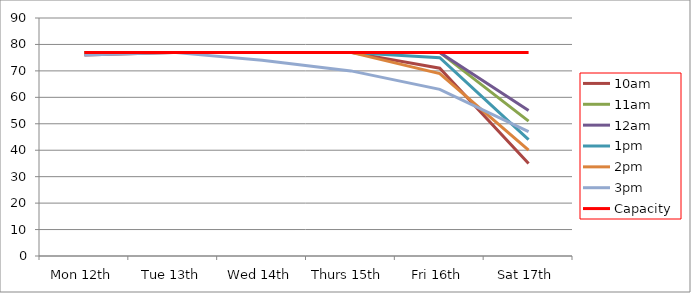
| Category | 9am | 10am | 11am | 12am | 1pm | 2pm | 3pm | 4pm | 5pm | Capacity |
|---|---|---|---|---|---|---|---|---|---|---|
| Mon 12th |  | 76 | 77 | 77 | 77 | 77 | 76 |  |  | 77 |
| Tue 13th |  | 77 | 77 | 77 | 77 | 77 | 77 |  |  | 77 |
| Wed 14th |  | 77 | 77 | 77 | 77 | 77 | 74 |  |  | 77 |
| Thurs 15th |  | 77 | 77 | 77 | 77 | 77 | 70 |  |  | 77 |
| Fri 16th |  | 71 | 77 | 77 | 75 | 69 | 63 |  |  | 77 |
| Sat 17th |  | 35 | 51 | 55 | 44 | 40 | 47 |  |  | 77 |